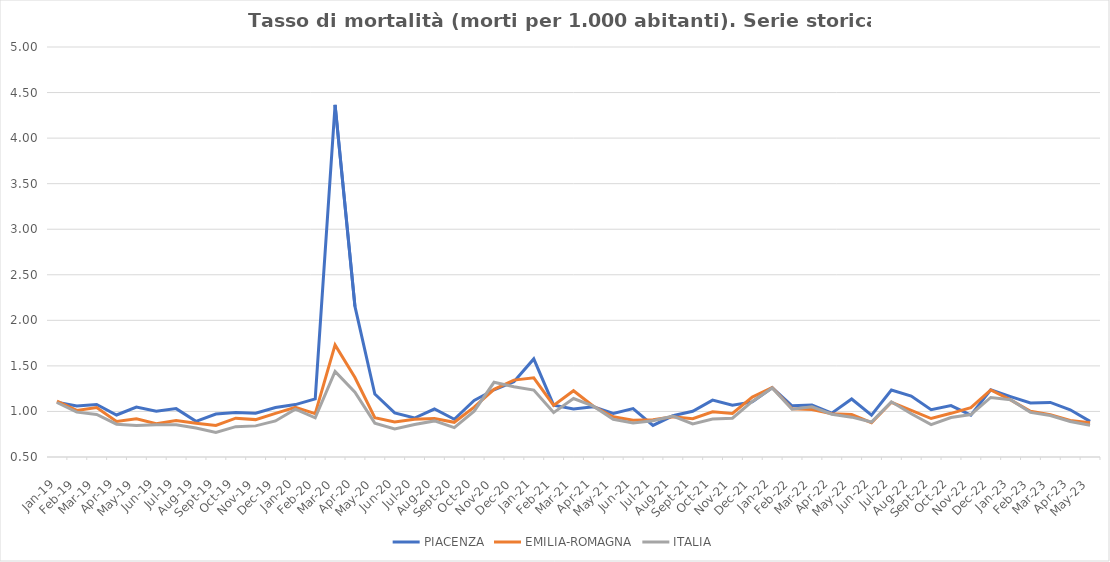
| Category | PIACENZA | EMILIA-ROMAGNA | ITALIA |
|---|---|---|---|
| 2019-01-01 | 1.101 | 1.113 | 1.098 |
| 2019-02-01 | 1.059 | 1.011 | 0.992 |
| 2019-03-01 | 1.076 | 1.042 | 0.967 |
| 2019-04-01 | 0.961 | 0.889 | 0.86 |
| 2019-05-01 | 1.048 | 0.919 | 0.846 |
| 2019-06-01 | 1.003 | 0.866 | 0.854 |
| 2019-07-01 | 1.031 | 0.9 | 0.854 |
| 2019-08-01 | 0.891 | 0.871 | 0.817 |
| 2019-09-01 | 0.971 | 0.846 | 0.768 |
| 2019-10-01 | 0.989 | 0.926 | 0.833 |
| 2019-11-01 | 0.981 | 0.91 | 0.842 |
| 2019-12-01 | 1.044 | 0.979 | 0.896 |
| 2020-01-01 | 1.075 | 1.045 | 1.026 |
| 2020-02-01 | 1.139 | 0.976 | 0.93 |
| 2020-03-01 | 4.365 | 1.73 | 1.44 |
| 2020-04-01 | 2.153 | 1.372 | 1.21 |
| 2020-05-01 | 1.191 | 0.932 | 0.872 |
| 2020-06-01 | 0.984 | 0.885 | 0.808 |
| 2020-07-01 | 0.928 | 0.915 | 0.857 |
| 2020-08-01 | 1.027 | 0.922 | 0.896 |
| 2020-09-01 | 0.914 | 0.881 | 0.823 |
| 2020-10-01 | 1.121 | 1.047 | 1.003 |
| 2020-11-01 | 1.238 | 1.243 | 1.32 |
| 2020-12-01 | 1.325 | 1.344 | 1.271 |
| 2021-01-01 | 1.577 | 1.369 | 1.235 |
| 2021-02-01 | 1.069 | 1.066 | 0.987 |
| 2021-03-01 | 1.027 | 1.227 | 1.142 |
| 2021-04-01 | 1.052 | 1.056 | 1.058 |
| 2021-05-01 | 0.978 | 0.942 | 0.915 |
| 2021-06-01 | 1.031 | 0.903 | 0.873 |
| 2021-07-01 | 0.847 | 0.91 | 0.898 |
| 2021-08-01 | 0.952 | 0.94 | 0.948 |
| 2021-09-01 | 1.001 | 0.92 | 0.864 |
| 2021-10-01 | 1.124 | 0.996 | 0.916 |
| 2021-11-01 | 1.068 | 0.978 | 0.926 |
| 2021-12-01 | 1.104 | 1.157 | 1.11 |
| 2022-01-01 | 1.26 | 1.263 | 1.258 |
| 2022-02-01 | 1.063 | 1.028 | 1.024 |
| 2022-03-01 | 1.07 | 1.021 | 1.051 |
| 2022-04-01 | 0.981 | 0.976 | 0.969 |
| 2022-05-01 | 1.137 | 0.966 | 0.937 |
| 2022-06-01 | 0.96 | 0.877 | 0.884 |
| 2022-07-01 | 1.235 | 1.1 | 1.106 |
| 2022-08-01 | 1.168 | 1.011 | 0.975 |
| 2022-09-01 | 1.019 | 0.922 | 0.855 |
| 2022-10-01 | 1.065 | 0.979 | 0.934 |
| 2022-11-01 | 0.959 | 1.042 | 0.966 |
| 2022-12-01 | 1.237 | 1.235 | 1.153 |
| 2023-01-01 | 1.163 | 1.127 | 1.129 |
| 2023-02-01 | 1.092 | 1.001 | 0.99 |
| 2023-03-01 | 1.099 | 0.963 | 0.956 |
| 2023-04-01 | 1.018 | 0.9 | 0.89 |
| 2023-05-01 | 0.891 | 0.876 | 0.848 |